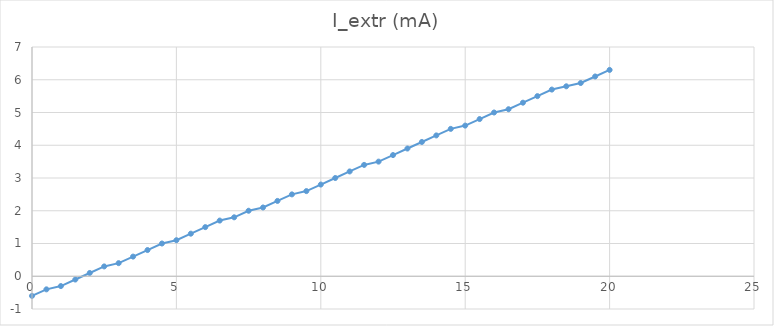
| Category | I_extr (mA) |
|---|---|
| 0.0 | -0.6 |
| 0.5 | -0.4 |
| 1.0 | -0.3 |
| 1.5 | -0.1 |
| 2.0 | 0.1 |
| 2.5 | 0.3 |
| 3.0 | 0.4 |
| 3.5 | 0.6 |
| 4.0 | 0.8 |
| 4.5 | 1 |
| 5.0 | 1.1 |
| 5.5 | 1.3 |
| 6.0 | 1.5 |
| 6.5 | 1.7 |
| 7.0 | 1.8 |
| 7.5 | 2 |
| 8.0 | 2.1 |
| 8.5 | 2.3 |
| 9.0 | 2.5 |
| 9.5 | 2.6 |
| 10.0 | 2.8 |
| 10.5 | 3 |
| 11.0 | 3.2 |
| 11.5 | 3.4 |
| 12.0 | 3.5 |
| 12.5 | 3.7 |
| 13.0 | 3.9 |
| 13.5 | 4.1 |
| 14.0 | 4.3 |
| 14.5 | 4.5 |
| 15.0 | 4.6 |
| 15.5 | 4.8 |
| 16.0 | 5 |
| 16.5 | 5.1 |
| 17.0 | 5.3 |
| 17.5 | 5.5 |
| 18.0 | 5.7 |
| 18.5 | 5.8 |
| 19.0 | 5.9 |
| 19.5 | 6.1 |
| 20.0 | 6.3 |